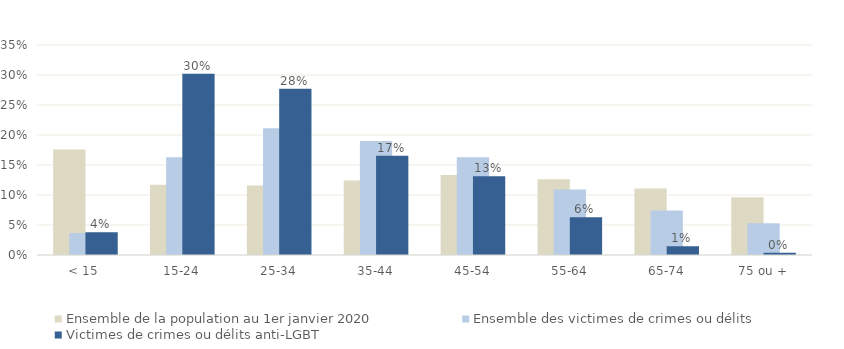
| Category | Ensemble de la population au 1er janvier 2020 | Ensemble des victimes de crimes ou délits | Victimes de crimes ou délits anti-LGBT |
|---|---|---|---|
| < 15 | 0.176 | 0.037 | 0.038 |
| 15-24 | 0.117 | 0.163 | 0.302 |
| 25-34 | 0.116 | 0.211 | 0.277 |
| 35-44 | 0.124 | 0.19 | 0.165 |
| 45-54 | 0.133 | 0.163 | 0.131 |
| 55-64 | 0.126 | 0.109 | 0.063 |
| 65-74 | 0.111 | 0.074 | 0.014 |
| 75 ou + | 0.096 | 0.053 | 0.004 |